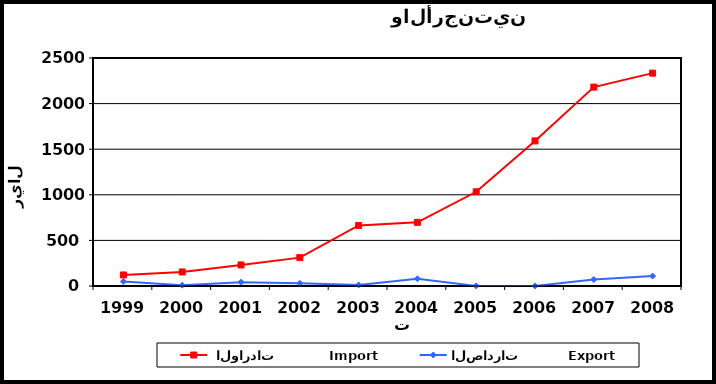
| Category |  الواردات           Import | الصادرات          Export |
|---|---|---|
| 1999.0 | 121 | 49 |
| 2000.0 | 154 | 9 |
| 2001.0 | 231 | 42 |
| 2002.0 | 311 | 30 |
| 2003.0 | 664 | 12 |
| 2004.0 | 698 | 79 |
| 2005.0 | 1033 | 1 |
| 2006.0 | 1591 | 1 |
| 2007.0 | 2181 | 71 |
| 2008.0 | 2334 | 109 |